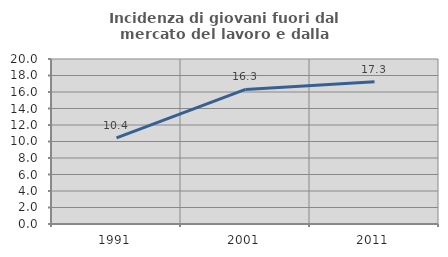
| Category | Incidenza di giovani fuori dal mercato del lavoro e dalla formazione  |
|---|---|
| 1991.0 | 10.44 |
| 2001.0 | 16.312 |
| 2011.0 | 17.257 |